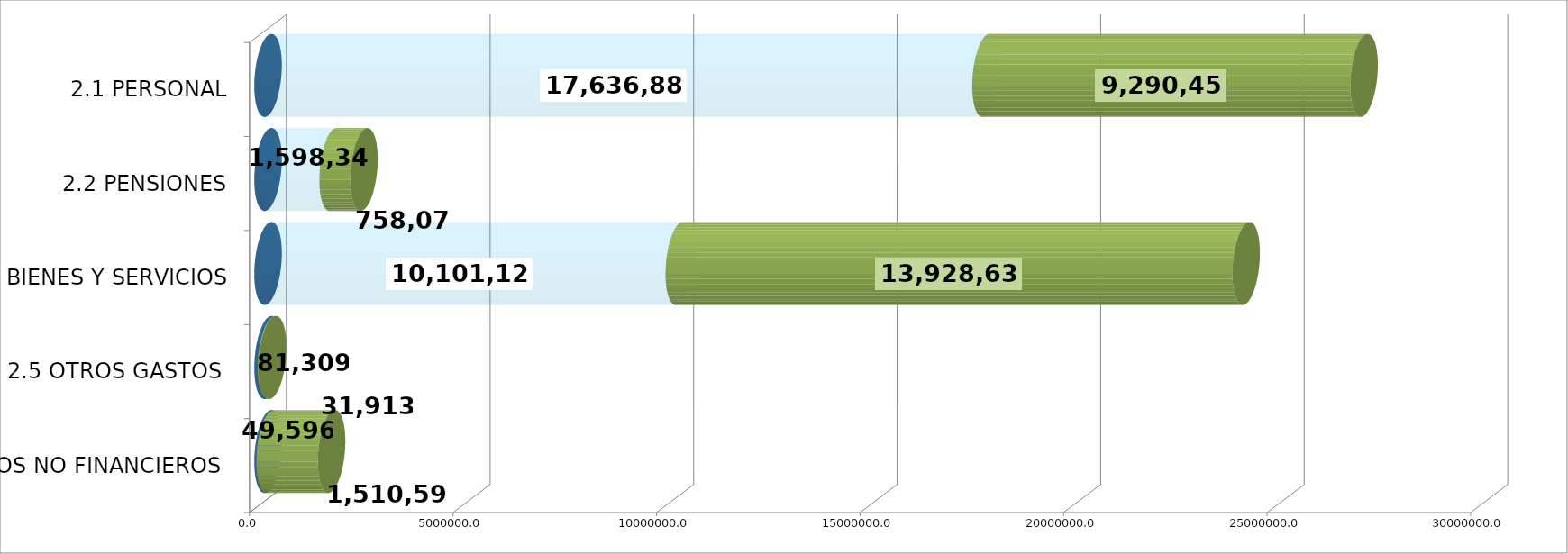
| Category | GENERICA | EJECUTADO | SALDO  |
|---|---|---|---|
| 2.1 PERSONAL | 0 | 17636880.33 | 9290452.67 |
| 2.2 PENSIONES | 0 | 1598346.29 | 758075.71 |
| 2.3 BIENES Y SERVICIOS | 0 | 10101128.43 | 13928633.57 |
| 2.5 OTROS GASTOS  | 0 | 81309 | 31913 |
| 2.6 ACTIVOS NO FINANCIEROS  | 0 | 49596.32 | 1510592.68 |